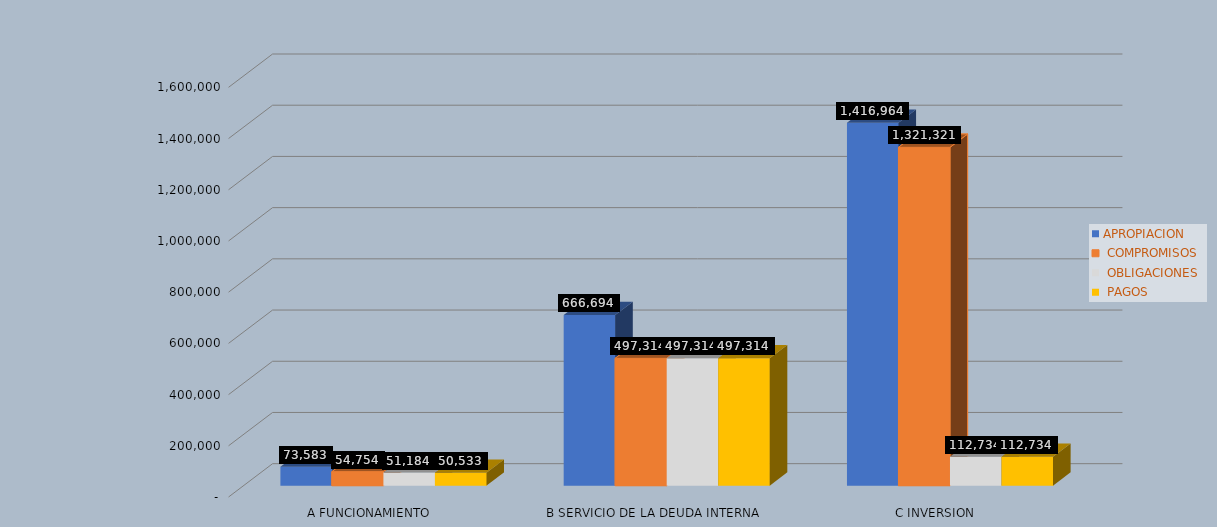
| Category | APROPIACION |  COMPROMISOS |  OBLIGACIONES |  PAGOS |
|---|---|---|---|---|
| A FUNCIONAMIENTO | 73583.024 | 54753.912 | 51183.711 | 50532.8 |
| B SERVICIO DE LA DEUDA INTERNA | 666693.529 | 497313.883 | 497313.883 | 497313.883 |
| C INVERSION | 1416964.092 | 1321321.341 | 112734.487 | 112734.487 |